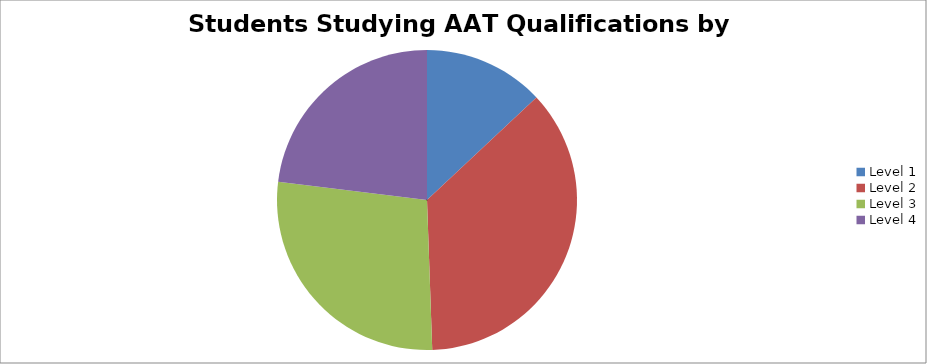
| Category | Series 0 | Series 1 |
|---|---|---|
| Level 1 | 35 |  |
| Level 2 | 98 |  |
| Level 3 | 74 |  |
| Level 4 | 62 |  |